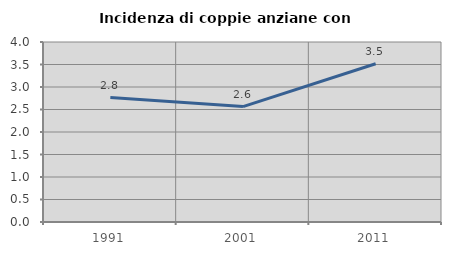
| Category | Incidenza di coppie anziane con figli |
|---|---|
| 1991.0 | 2.765 |
| 2001.0 | 2.564 |
| 2011.0 | 3.518 |